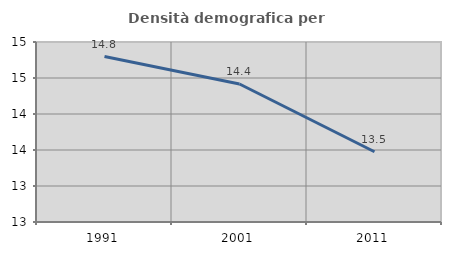
| Category | Densità demografica |
|---|---|
| 1991.0 | 14.798 |
| 2001.0 | 14.417 |
| 2011.0 | 13.476 |